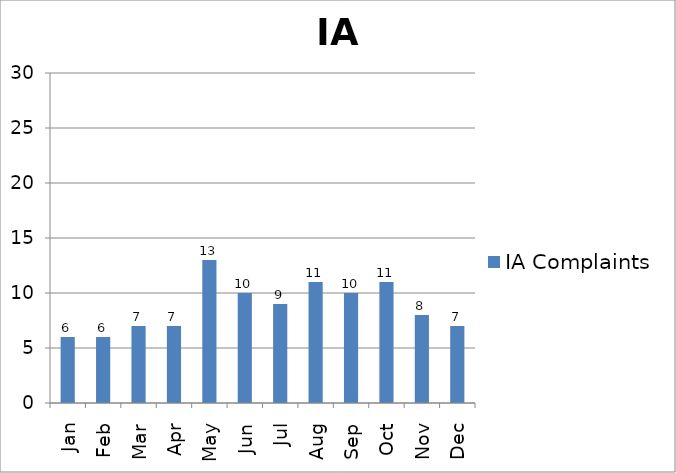
| Category | IA Complaints |
|---|---|
| Jan | 6 |
| Feb | 6 |
| Mar | 7 |
| Apr | 7 |
| May | 13 |
| Jun | 10 |
| Jul | 9 |
| Aug | 11 |
| Sep | 10 |
| Oct | 11 |
| Nov | 8 |
| Dec | 7 |